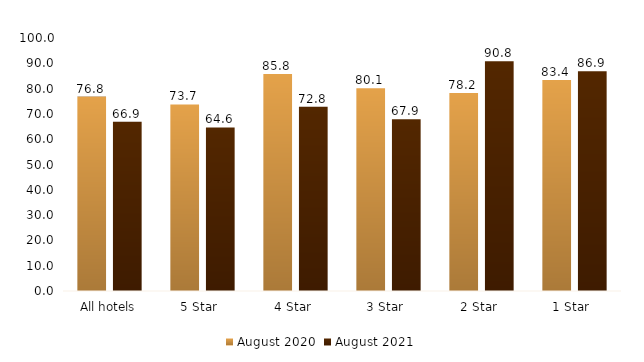
| Category | August 2020 | August 2021 |
|---|---|---|
| All hotels | 76.84 | 66.924 |
| 5 Star  | 73.717 | 64.636 |
| 4 Star  | 85.765 | 72.799 |
| 3 Star  | 80.109 | 67.933 |
| 2 Star  | 78.235 | 90.838 |
| 1 Star  | 83.423 | 86.893 |